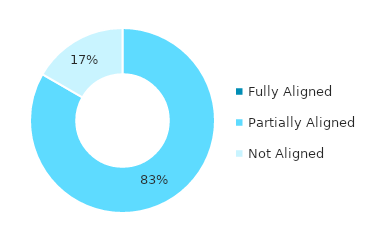
| Category | Series 0 |
|---|---|
| Fully Aligned | 0 |
| Partially Aligned | 0.833 |
| Not Aligned | 0.167 |